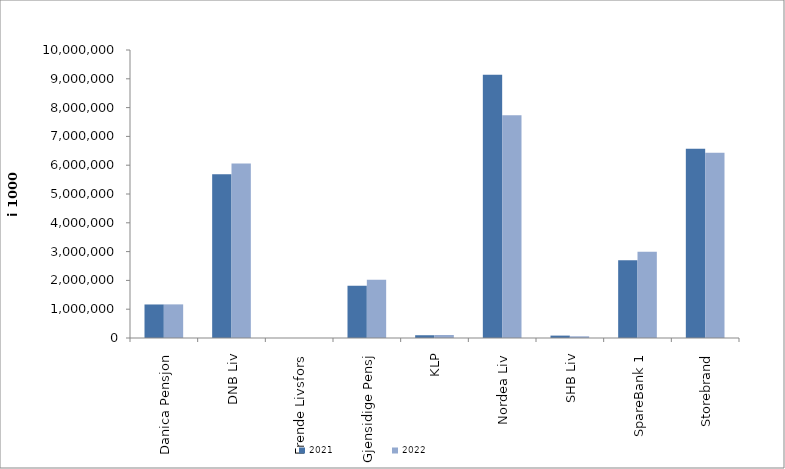
| Category | 2021 | 2022 |
|---|---|---|
| Danica Pensjon | 1164087.904 | 1167273.505 |
| DNB Liv | 5687337 | 6060306.909 |
| Frende Livsfors | 0 | 0 |
| Gjensidige Pensj | 1813519 | 2022284 |
| KLP | 96259.103 | 103293.625 |
| Nordea Liv | 9140677.717 | 7731556.819 |
| SHB Liv | 83074.45 | 57940.99 |
| SpareBank 1 | 2700593.746 | 2999062.731 |
| Storebrand | 6574958.287 | 6429774.228 |